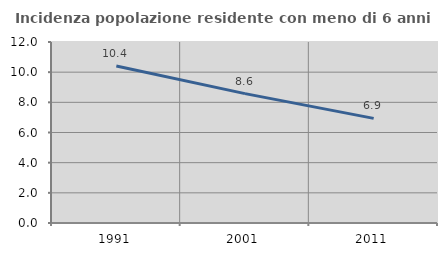
| Category | Incidenza popolazione residente con meno di 6 anni |
|---|---|
| 1991.0 | 10.414 |
| 2001.0 | 8.577 |
| 2011.0 | 6.935 |